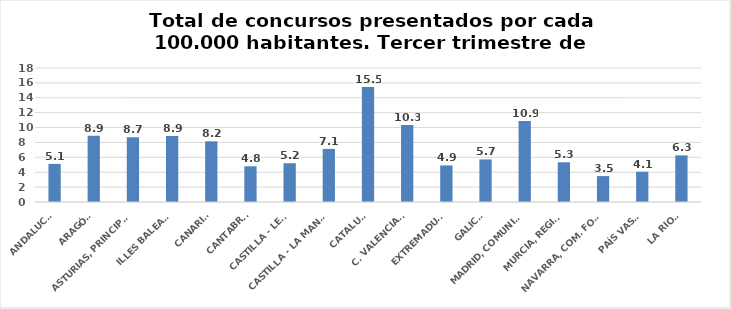
| Category | Series 0 |
|---|---|
| ANDALUCÍA | 5.119 |
| ARAGÓN | 8.903 |
| ASTURIAS, PRINCIPADO | 8.699 |
| ILLES BALEARS | 8.871 |
| CANARIAS | 8.152 |
| CANTABRIA | 4.792 |
| CASTILLA - LEÓN | 5.207 |
| CASTILLA - LA MANCHA | 7.13 |
| CATALUÑA | 15.457 |
| C. VALENCIANA | 10.338 |
| EXTREMADURA | 4.911 |
| GALICIA | 5.716 |
| MADRID, COMUNIDAD | 10.866 |
| MURCIA, REGIÓN | 5.336 |
| NAVARRA, COM. FORAL | 3.479 |
| PAÍS VASCO | 4.068 |
| LA RIOJA | 6.265 |